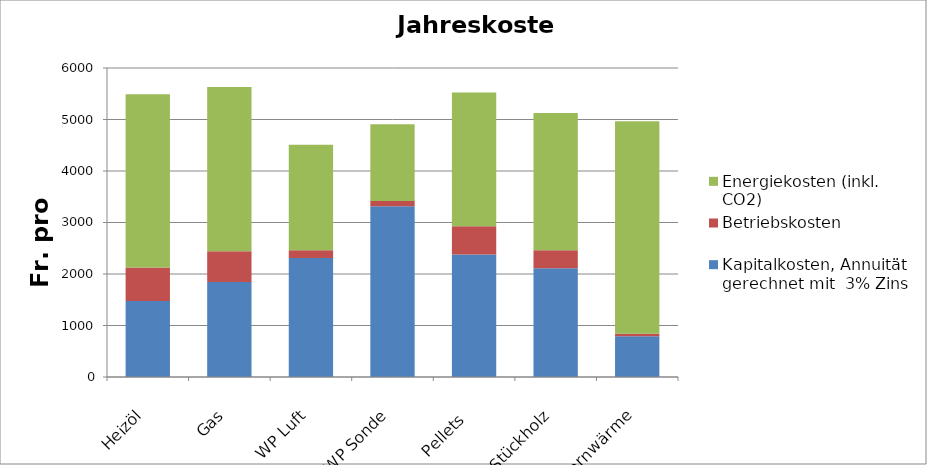
| Category | Kapitalkosten, Annuität gerechnet mit  3% Zins | Betriebskosten | Energiekosten (inkl. CO2) |
|---|---|---|---|
| Heizöl | 1474 | 650 | 3365 |
| Gas | 1842.5 | 600 | 3190 |
| WP Luft | 2311.5 | 150 | 2049.231 |
| WP Sonde | 3317.4 | 100 | 1488.333 |
| Pellets  | 2378.5 | 550 | 2595 |
| Stückholz | 2110.5 | 350 | 2665 |
| Fernwärme | 790.5 | 50 | 4125 |